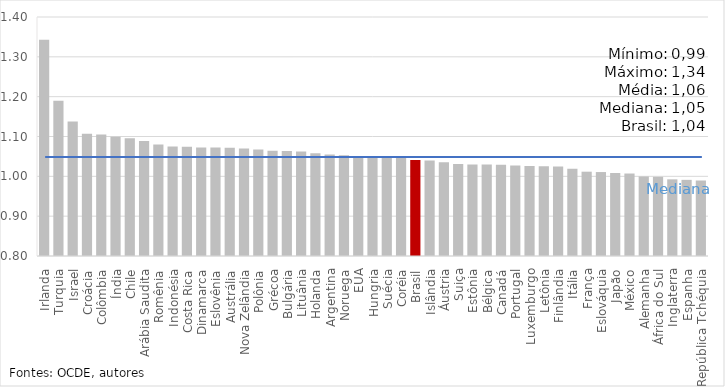
| Category | Series 0 |
|---|---|
| Irlanda | 1.343 |
| Turquia | 1.19 |
| Israel | 1.138 |
| Croácia | 1.107 |
| Colômbia | 1.105 |
| Índia | 1.099 |
| Chile | 1.096 |
| Arábia Saudita | 1.089 |
| Romênia | 1.08 |
| Indonésia | 1.075 |
| Costa Rica | 1.074 |
| Dinamarca | 1.073 |
| Eslovênia | 1.072 |
| Austrália | 1.072 |
| Nova Zelândia | 1.07 |
| Polônia | 1.067 |
| Grécoa | 1.064 |
| Bulgária | 1.064 |
| Lituânia | 1.063 |
| Holanda | 1.058 |
| Argentina | 1.055 |
| Noruega | 1.053 |
| EUA | 1.051 |
| Hungria | 1.048 |
| Suécia | 1.047 |
| Coréia | 1.046 |
| Brasil | 1.041 |
| Islândia | 1.039 |
| Áustria | 1.035 |
| Suiça | 1.031 |
| Estônia | 1.03 |
| Bélgica | 1.03 |
| Canadá | 1.029 |
| Portugal | 1.027 |
| Luxemburgo | 1.026 |
| Letônia | 1.025 |
| Finlândia | 1.025 |
| Itália | 1.019 |
| França | 1.012 |
| Eslováquia | 1.011 |
| Japão | 1.008 |
| México | 1.007 |
| Alemanha | 1 |
| África do Sul | 0.999 |
| Inglaterra | 0.992 |
| Espanha | 0.991 |
| República Tchéquia | 0.99 |